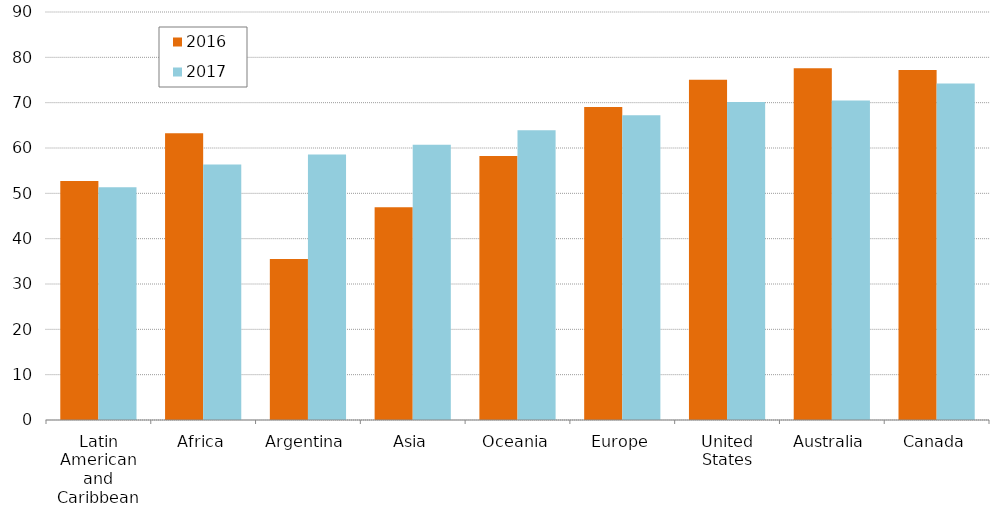
| Category |   2016 |   2017 |
|---|---|---|
| Latin American and Caribbean | 52.7 | 51.33 |
| Africa | 63.28 | 56.35 |
| Argentina | 35.51 | 58.57 |
| Asia | 46.945 | 60.69 |
| Oceania | 58.22 | 63.91 |
| Europe | 69.02 | 67.24 |
| United States | 75.03 | 70.12 |
| Australia | 77.61 | 70.47 |
| Canada | 77.21 | 74.255 |